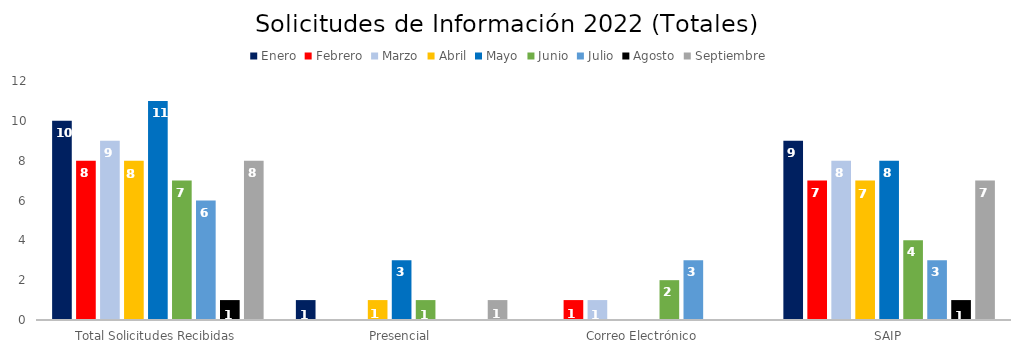
| Category | Enero | Febrero | Marzo | Abril | Mayo | Junio | Julio | Agosto | Septiembre |
|---|---|---|---|---|---|---|---|---|---|
| Total Solicitudes Recibidas | 10 | 8 | 9 | 8 | 11 | 7 | 6 | 1 | 8 |
| Presencial | 1 | 0 | 0 | 1 | 3 | 1 | 0 | 0 | 1 |
| Correo Electrónico  | 0 | 1 | 1 | 0 | 0 | 2 | 3 | 0 | 0 |
| SAIP | 9 | 7 | 8 | 7 | 8 | 4 | 3 | 1 | 7 |